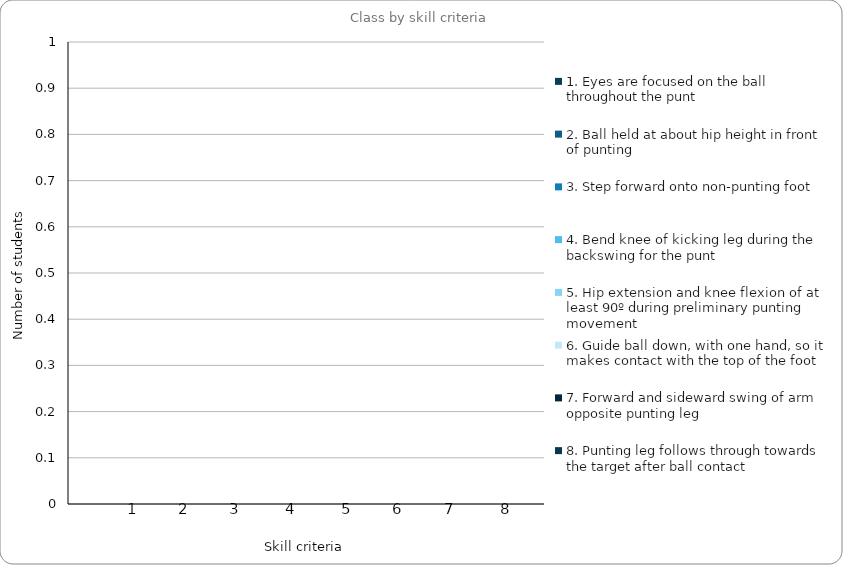
| Category | 1. Eyes are focused on the ball throughout the punt | 2. Ball held at about hip height in front of punting | 3. Step forward onto non-punting foot | 4. Bend knee of kicking leg during the backswing for the punt  | 5. Hip extension and knee flexion of at least 90º during preliminary punting movement | 6. Guide ball down, with one hand, so it makes contact with the top of the foot | 7. Forward and sideward swing of arm opposite punting leg | 8. Punting leg follows through towards the target after ball contact |
|---|---|---|---|---|---|---|---|---|
| 0 | 0 | 0 | 0 | 0 | 0 | 0 | 0 | 0 |